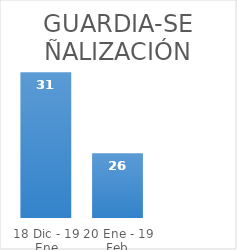
| Category | Series 0 |
|---|---|
| 18 Dic - 19 Ene | 31 |
| 20 Ene - 19 Feb | 26 |